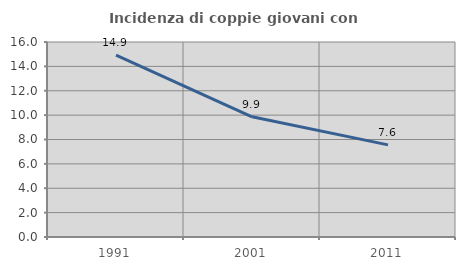
| Category | Incidenza di coppie giovani con figli |
|---|---|
| 1991.0 | 14.925 |
| 2001.0 | 9.864 |
| 2011.0 | 7.561 |